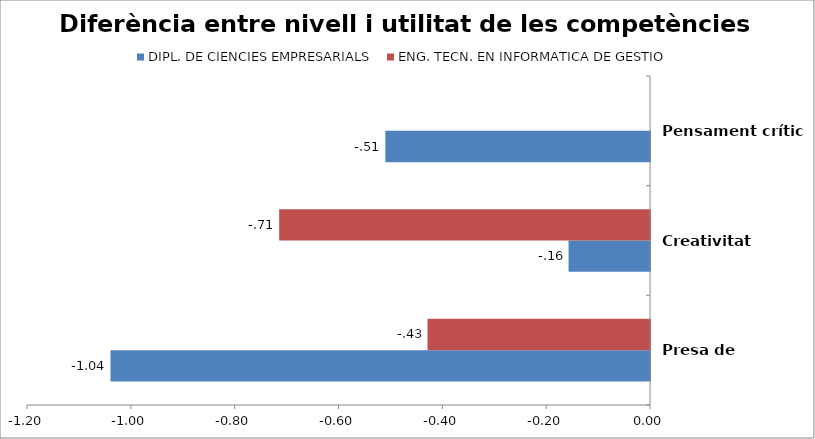
| Category | DIPL. DE CIENCIES EMPRESARIALS | ENG. TECN. EN INFORMATICA DE GESTIO |
|---|---|---|
| Presa de decisions | -1.039 | -0.429 |
| Creativitat | -0.157 | -0.714 |
| Pensament crític | -0.51 | 0 |